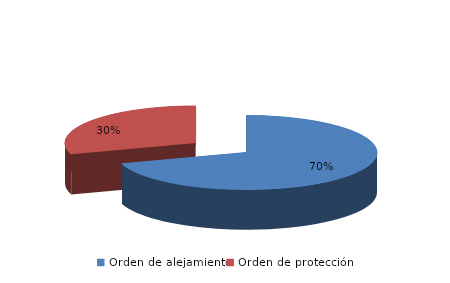
| Category | Series 0 |
|---|---|
| Orden de alejamiento | 131 |
| Orden de protección | 56 |